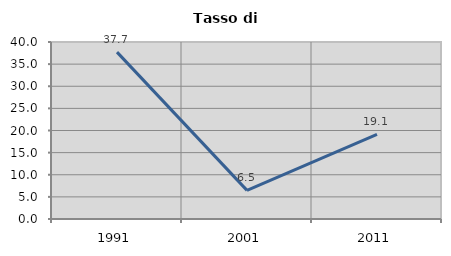
| Category | Tasso di disoccupazione   |
|---|---|
| 1991.0 | 37.716 |
| 2001.0 | 6.468 |
| 2011.0 | 19.136 |